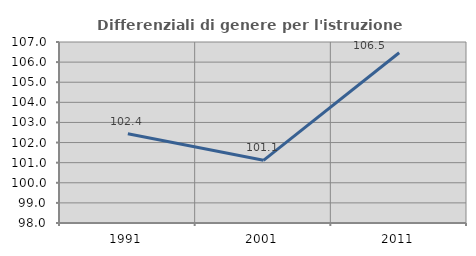
| Category | Differenziali di genere per l'istruzione superiore |
|---|---|
| 1991.0 | 102.435 |
| 2001.0 | 101.116 |
| 2011.0 | 106.465 |